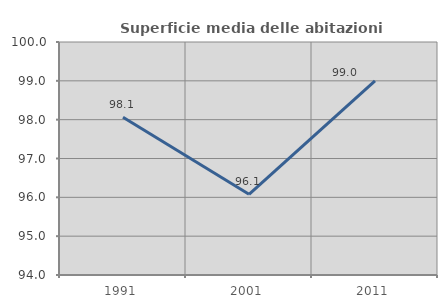
| Category | Superficie media delle abitazioni occupate |
|---|---|
| 1991.0 | 98.063 |
| 2001.0 | 96.078 |
| 2011.0 | 99.002 |